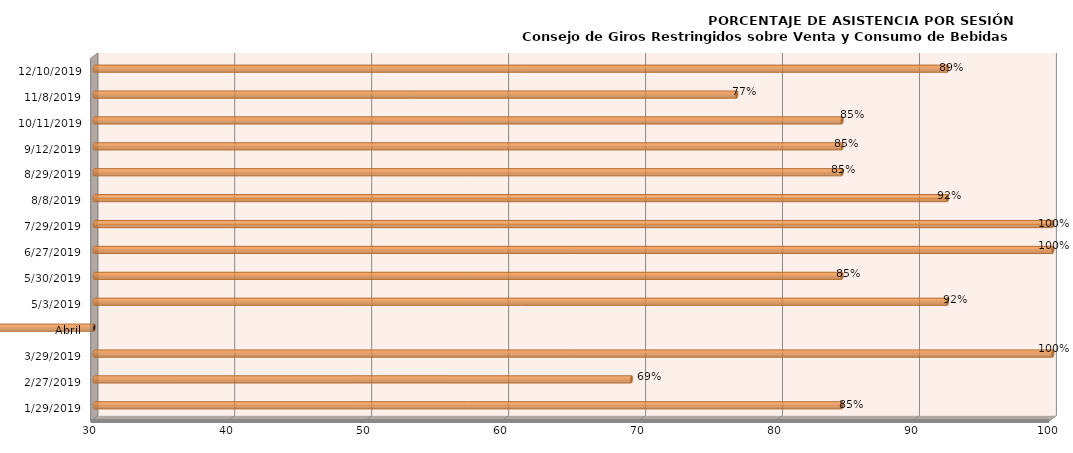
| Category | Series 0 |
|---|---|
| 29/01/2019 | 84.615 |
| 27/02/2019 | 69.231 |
| 29/03/2019 | 100 |
| Abril | 0 |
| 03/05/2019 | 92.308 |
| 30/05/2019 | 84.615 |
| 27/06/2019 | 100 |
| 29/07/2019 | 100 |
| 08/08/2019 | 92.308 |
| 29/08/2019 | 84.615 |
| 12/09/2019 | 84.615 |
| 11/10/2019 | 84.615 |
| 08/11/2019 | 76.923 |
| 10/12/2019 | 92.308 |